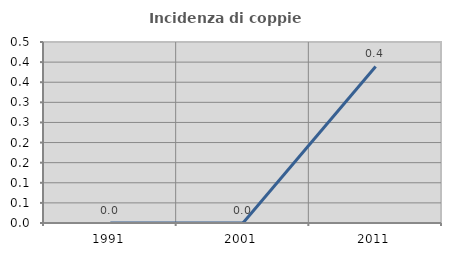
| Category | Incidenza di coppie miste |
|---|---|
| 1991.0 | 0 |
| 2001.0 | 0 |
| 2011.0 | 0.389 |